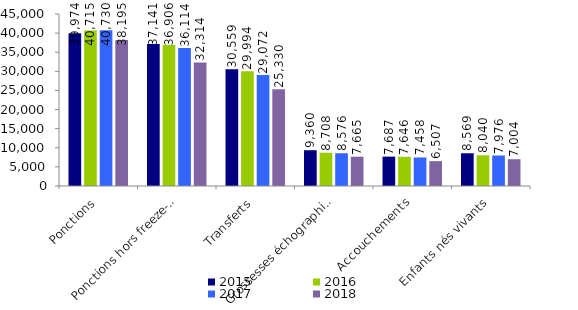
| Category | 2015 | 2016 | 2017 | 2018 |
|---|---|---|---|---|
| Ponctions | 39974 | 40715 | 40730 | 38195 |
| Ponctions hors freeze-all* | 37141 | 36906 | 36114 | 32314 |
| Transferts | 30559 | 29994 | 29072 | 25330 |
| Grossesses échographiques | 9360 | 8708 | 8576 | 7665 |
| Accouchements | 7687 | 7646 | 7458 | 6507 |
| Enfants nés vivants | 8569 | 8040 | 7976 | 7004 |